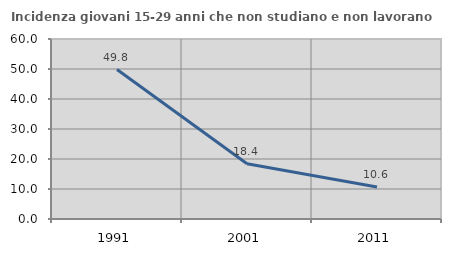
| Category | Incidenza giovani 15-29 anni che non studiano e non lavorano  |
|---|---|
| 1991.0 | 49.823 |
| 2001.0 | 18.421 |
| 2011.0 | 10.638 |